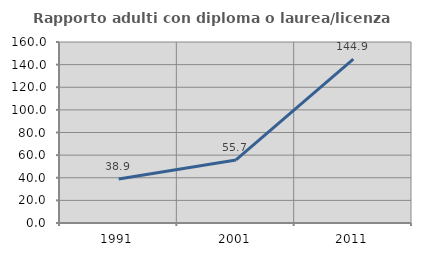
| Category | Rapporto adulti con diploma o laurea/licenza media  |
|---|---|
| 1991.0 | 38.889 |
| 2001.0 | 55.704 |
| 2011.0 | 144.907 |